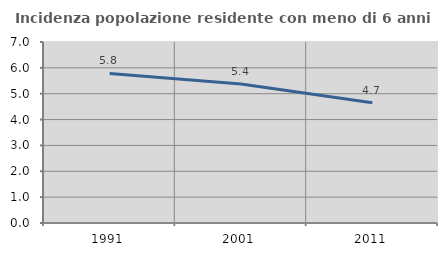
| Category | Incidenza popolazione residente con meno di 6 anni |
|---|---|
| 1991.0 | 5.786 |
| 2001.0 | 5.373 |
| 2011.0 | 4.652 |